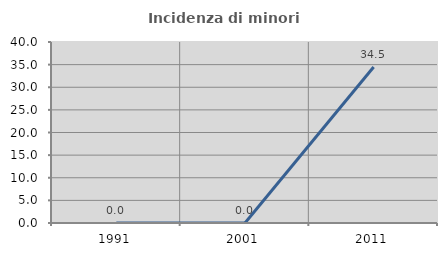
| Category | Incidenza di minori stranieri |
|---|---|
| 1991.0 | 0 |
| 2001.0 | 0 |
| 2011.0 | 34.483 |